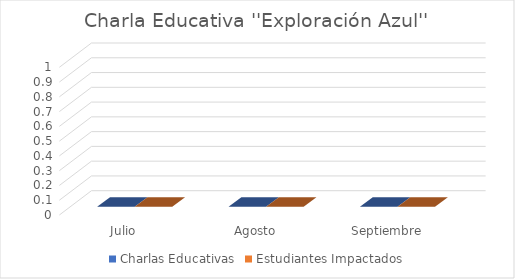
| Category | Charlas Educativas | Estudiantes Impactados |
|---|---|---|
| Julio | 0 | 0 |
| Agosto | 0 | 0 |
| Septiembre | 0 | 0 |